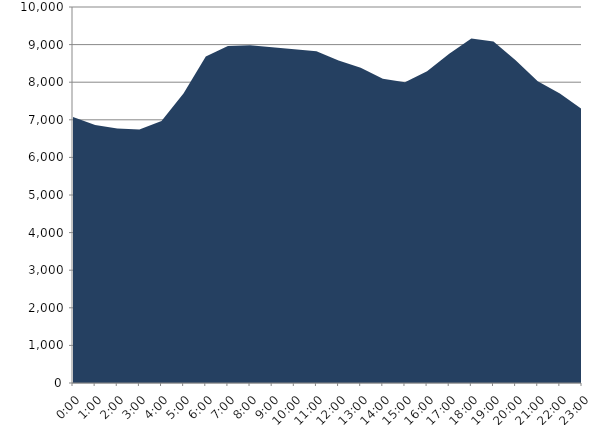
| Category | Series 0 | Series 1 |
|---|---|---|
| 2024-03-20 |  | 7071.267 |
| 2024-03-20 01:00:00 |  | 6862.819 |
| 2024-03-20 02:00:00 |  | 6767.931 |
| 2024-03-20 03:00:00 |  | 6741.099 |
| 2024-03-20 04:00:00 |  | 6967.366 |
| 2024-03-20 05:00:00 |  | 7704.766 |
| 2024-03-20 06:00:00 |  | 8686.439 |
| 2024-03-20 07:00:00 |  | 8959.75 |
| 2024-03-20 08:00:00 |  | 8979.925 |
| 2024-03-20 09:00:00 |  | 8932.064 |
| 2024-03-20 10:00:00 |  | 8873.752 |
| 2024-03-20 11:00:00 |  | 8823.62 |
| 2024-03-20 12:00:00 |  | 8577.741 |
| 2024-03-20 13:00:00 |  | 8384.124 |
| 2024-03-20 14:00:00 |  | 8093.415 |
| 2024-03-20 15:00:00 |  | 7997.072 |
| 2024-03-20 16:00:00 |  | 8292.357 |
| 2024-03-20 17:00:00 |  | 8757.101 |
| 2024-03-20 18:00:00 |  | 9159.92 |
| 2024-03-20 19:00:00 |  | 9081.414 |
| 2024-03-20 20:00:00 |  | 8584.096 |
| 2024-03-20 21:00:00 |  | 8026.532 |
| 2024-03-20 22:00:00 |  | 7702.022 |
| 2024-03-20 23:00:00 |  | 7281.431 |